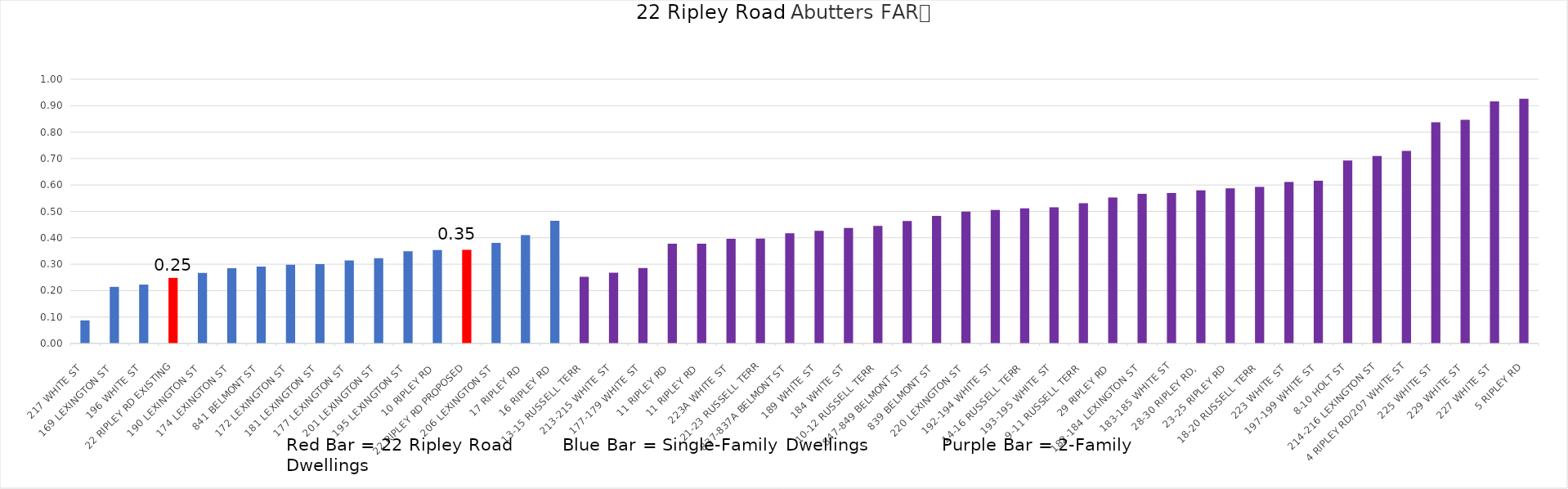
| Category | FAR |
|---|---|
| 217 WHITE ST  | 0.087 |
| 169 LEXINGTON ST  | 0.214 |
| 196 WHITE ST  | 0.223 |
| 22 RIPLEY RD EXISTING | 0.248 |
| 190 LEXINGTON ST  | 0.267 |
| 174 LEXINGTON ST  | 0.285 |
| 841 BELMONT ST  | 0.291 |
| 172 LEXINGTON ST  | 0.298 |
| 181 LEXINGTON ST  | 0.3 |
| 177 LEXINGTON ST  | 0.314 |
| 201 LEXINGTON ST  | 0.323 |
| 195 LEXINGTON ST  | 0.349 |
| 10 RIPLEY RD  | 0.353 |
| 22 RIPLEY RD PROPOSED | 0.354 |
| 206 LEXINGTON ST  | 0.381 |
| 17 RIPLEY RD  | 0.411 |
| 16 RIPLEY RD  | 0.464 |
| 13-15 RUSSELL TERR  | 0.252 |
| 213-215 WHITE ST  | 0.268 |
| 177-179 WHITE ST  | 0.286 |
| 11 RIPLEY RD  | 0.378 |
| 11 RIPLEY RD  | 0.378 |
| 223A WHITE ST  | 0.397 |
| 21-23 RUSSELL TERR | 0.397 |
| 837-837A BELMONT ST  | 0.417 |
| 189 WHITE ST  | 0.426 |
| 184 WHITE ST  | 0.437 |
| 10-12 RUSSELL TERR  | 0.445 |
| 847-849 BELMONT ST  | 0.464 |
| 839 BELMONT ST  | 0.483 |
| 220 LEXINGTON ST  | 0.499 |
| 192-194 WHITE ST  | 0.505 |
| 14-16 RUSSELL TERR  | 0.511 |
| 193-195 WHITE ST  | 0.515 |
| 9-11 RUSSELL TERR  | 0.531 |
| 29 RIPLEY RD  | 0.553 |
| 182-184 LEXINGTON ST  | 0.567 |
| 183-185 WHITE ST | 0.57 |
| 28-30 RIPLEY RD,  | 0.58 |
| 23-25 RIPLEY RD  | 0.587 |
| 18-20 RUSSELL TERR  | 0.593 |
| 223 WHITE ST  | 0.612 |
| 197-199 WHITE ST  | 0.616 |
| 8-10 HOLT ST | 0.693 |
| 214-216 LEXINGTON ST | 0.709 |
| 4 RIPLEY RD/207 WHITE ST | 0.729 |
| 225 WHITE ST  | 0.838 |
| 229 WHITE ST  | 0.847 |
| 227 WHITE ST  | 0.916 |
| 5 RIPLEY RD | 0.927 |